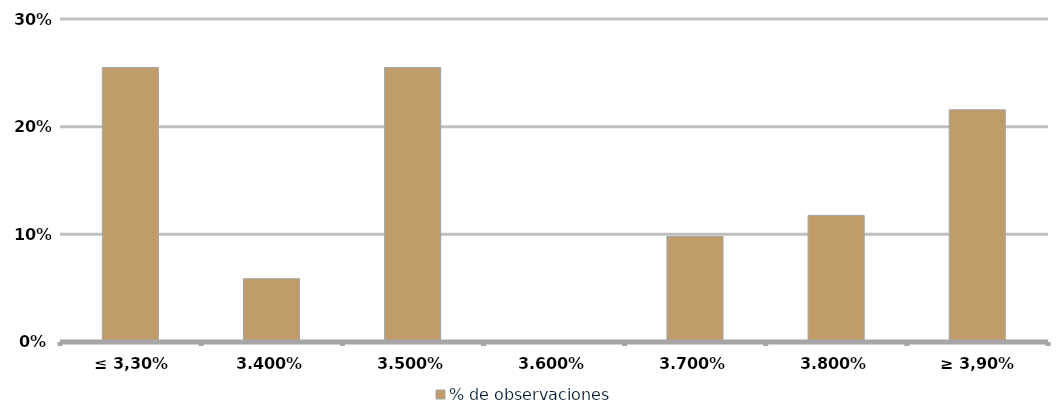
| Category | % de observaciones  |
|---|---|
| ≤ 3,30% | 0.255 |
| 3,40% | 0.059 |
| 3,50% | 0.255 |
| 3,60% | 0 |
| 3,70% | 0.098 |
| 3,80% | 0.118 |
| ≥ 3,90% | 0.216 |